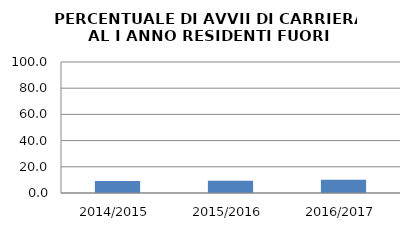
| Category | 2014/2015 2015/2016 2016/2017 |
|---|---|
| 2014/2015 | 9.195 |
| 2015/2016 | 9.375 |
| 2016/2017 | 10.112 |